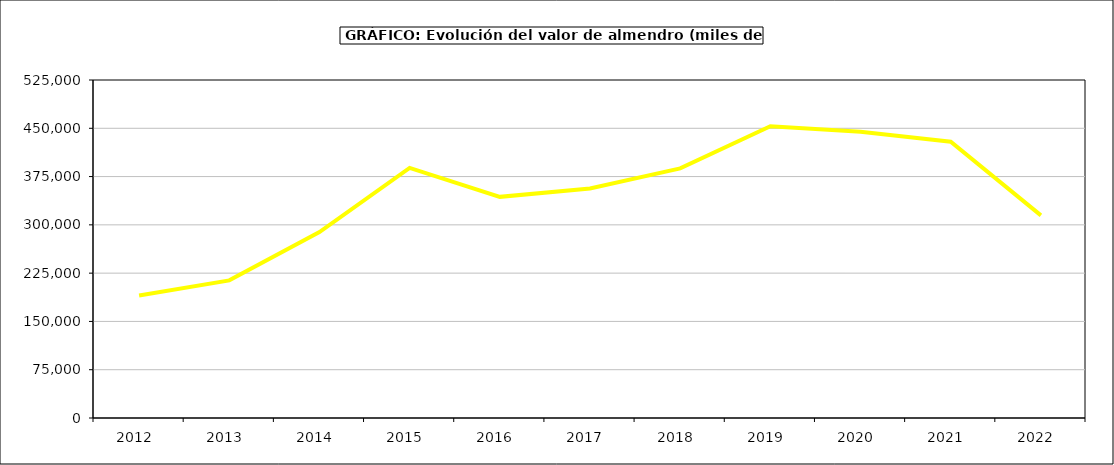
| Category | valor almendro |
|---|---|
| 2012.0 | 190305.336 |
| 2013.0 | 213791.63 |
| 2014.0 | 288832.154 |
| 2015.0 | 388475 |
| 2016.0 | 343509 |
| 2017.0 | 356619.875 |
| 2018.0 | 387785.945 |
| 2019.0 | 453304.604 |
| 2020.0 | 444587.745 |
| 2021.0 | 429147.738 |
| 2022.0 | 314655.739 |